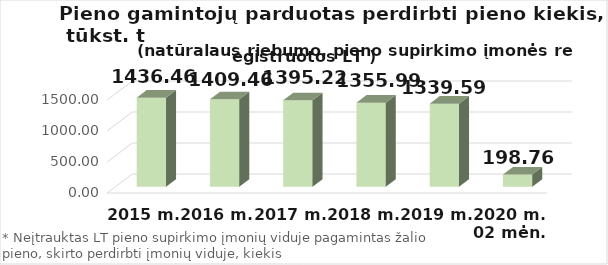
| Category | Lietuvos pieno supirkimo įmonėms* |
|---|---|
| 2015 m. | 1436.455 |
| 2016 m. | 1409.46 |
| 2017 m.  | 1395.224 |
| 2018 m.  | 1355.989 |
| 2019 m.  | 1339.59 |
| 2020 m. 02 mėn. | 198.76 |